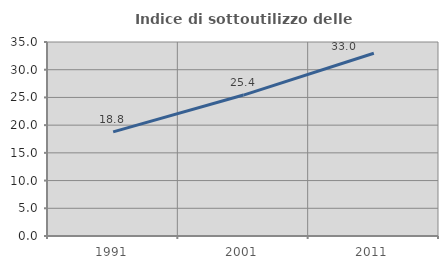
| Category | Indice di sottoutilizzo delle abitazioni  |
|---|---|
| 1991.0 | 18.788 |
| 2001.0 | 25.428 |
| 2011.0 | 32.965 |